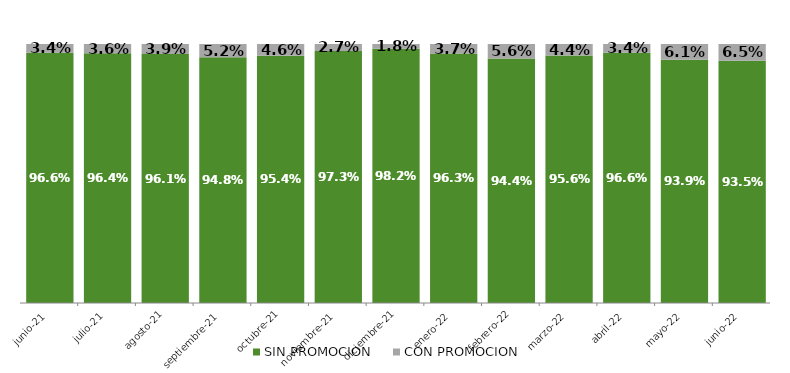
| Category | SIN PROMOCION   | CON PROMOCION   |
|---|---|---|
| 2021-06-01 | 0.966 | 0.034 |
| 2021-07-01 | 0.964 | 0.036 |
| 2021-08-01 | 0.961 | 0.039 |
| 2021-09-01 | 0.948 | 0.052 |
| 2021-10-01 | 0.954 | 0.046 |
| 2021-11-01 | 0.973 | 0.027 |
| 2021-12-01 | 0.982 | 0.018 |
| 2022-01-01 | 0.963 | 0.037 |
| 2022-02-01 | 0.944 | 0.056 |
| 2022-03-01 | 0.956 | 0.044 |
| 2022-04-01 | 0.966 | 0.034 |
| 2022-05-01 | 0.939 | 0.061 |
| 2022-06-01 | 0.935 | 0.065 |